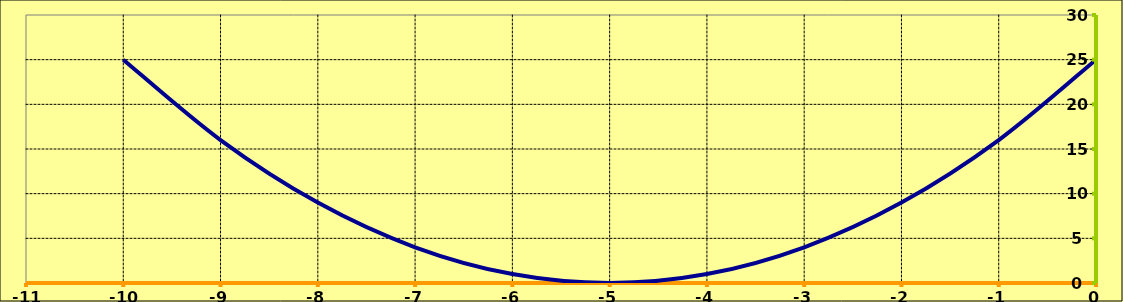
| Category | Series 0 |
|---|---|
| -10.0 | 25 |
| -9.0 | 16 |
| -8.0 | 9 |
| -7.0 | 4 |
| -6.0 | 1 |
| -5.0 | 0 |
| -4.0 | 1 |
| -3.0 | 4 |
| -2.0 | 9 |
| -1.0 | 16 |
| 0.0 | 25 |